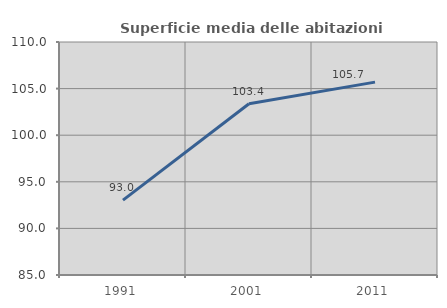
| Category | Superficie media delle abitazioni occupate |
|---|---|
| 1991.0 | 93.037 |
| 2001.0 | 103.381 |
| 2011.0 | 105.695 |